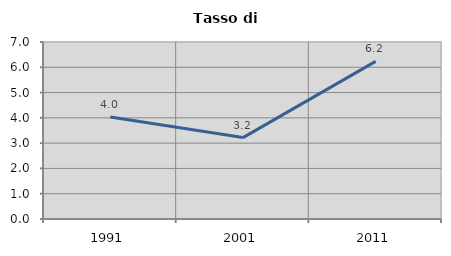
| Category | Tasso di disoccupazione   |
|---|---|
| 1991.0 | 4.033 |
| 2001.0 | 3.22 |
| 2011.0 | 6.234 |